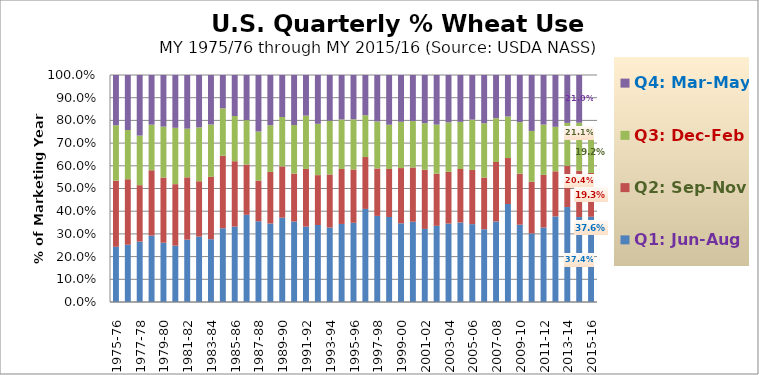
| Category | Q1: Jun-Aug | Q2: Sep-Nov | Q3: Dec-Feb | Q4: Mar-May |
|---|---|---|---|---|
| 1975-76 | 0.243 | 0.291 | 0.244 | 0.221 |
| 1976-77 | 0.252 | 0.288 | 0.217 | 0.242 |
| 1977-78 | 0.266 | 0.249 | 0.218 | 0.267 |
| 1978-79 | 0.292 | 0.288 | 0.201 | 0.219 |
| 1979-80 | 0.261 | 0.287 | 0.224 | 0.227 |
| 1980-81 | 0.248 | 0.271 | 0.248 | 0.233 |
| 1981-82 | 0.275 | 0.274 | 0.214 | 0.236 |
| 1982-83 | 0.288 | 0.244 | 0.237 | 0.231 |
| 1983-84 | 0.277 | 0.275 | 0.23 | 0.218 |
| 1984-85 | 0.325 | 0.32 | 0.209 | 0.147 |
| 1985-86 | 0.332 | 0.288 | 0.199 | 0.181 |
| 1986-87 | 0.384 | 0.222 | 0.195 | 0.199 |
| 1987-88 | 0.356 | 0.179 | 0.216 | 0.249 |
| 1988-89 | 0.346 | 0.227 | 0.205 | 0.221 |
| 1989-90 | 0.371 | 0.226 | 0.218 | 0.185 |
| 1990-91 | 0.355 | 0.211 | 0.214 | 0.22 |
| 1991-92 | 0.332 | 0.254 | 0.235 | 0.179 |
| 1992-93 | 0.339 | 0.22 | 0.226 | 0.215 |
| 1993-94 | 0.328 | 0.234 | 0.237 | 0.201 |
| 1994-95 | 0.344 | 0.242 | 0.218 | 0.196 |
| 1995-96 | 0.349 | 0.235 | 0.221 | 0.195 |
| 1996-97 | 0.41 | 0.229 | 0.184 | 0.177 |
| 1997-98 | 0.379 | 0.209 | 0.207 | 0.204 |
| 1998-99 | 0.374 | 0.212 | 0.195 | 0.219 |
| 1999-00 | 0.347 | 0.243 | 0.204 | 0.206 |
| 2000-01 | 0.354 | 0.239 | 0.205 | 0.203 |
| 2001-02 | 0.322 | 0.261 | 0.205 | 0.213 |
| 2002-03 | 0.336 | 0.23 | 0.216 | 0.218 |
| 2003-04 | 0.345 | 0.228 | 0.218 | 0.209 |
| 2004-05 | 0.35 | 0.236 | 0.208 | 0.206 |
| 2005-06 | 0.343 | 0.239 | 0.222 | 0.197 |
| 2006-07 | 0.321 | 0.228 | 0.239 | 0.213 |
| 2007-08 | 0.355 | 0.262 | 0.193 | 0.19 |
| 2008-09 | 0.432 | 0.203 | 0.183 | 0.183 |
| 2009-10 | 0.34 | 0.225 | 0.227 | 0.208 |
| 2010-11 | 0.302 | 0.228 | 0.224 | 0.246 |
| 2011-12 | 0.328 | 0.232 | 0.222 | 0.218 |
| 2012-13 | 0.377 | 0.199 | 0.196 | 0.228 |
| 2013-14 | 0.418 | 0.182 | 0.189 | 0.211 |
| 2014-15 | 0.374 | 0.204 | 0.211 | 0.21 |
| 2015-16 | 0.376 | 0.193 | 0.192 | 0 |